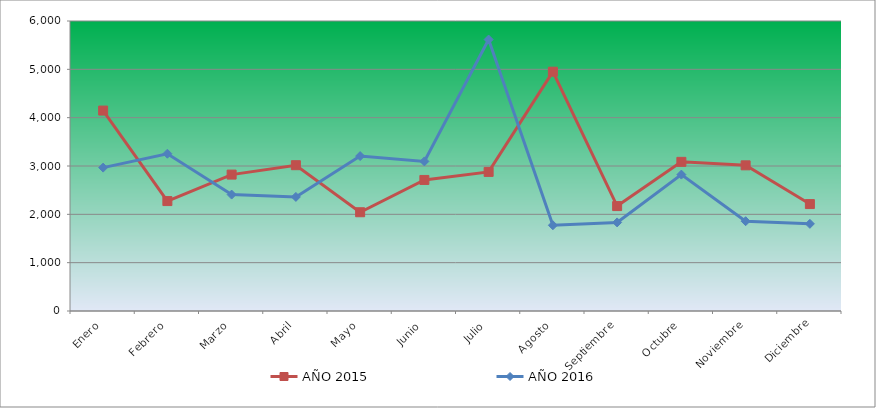
| Category | AÑO 2015 | AÑO 2016 |
|---|---|---|
| Enero | 4146.808 | 2966.609 |
| Febrero | 2274.503 | 3253.957 |
| Marzo | 2822.326 | 2408.709 |
| Abril | 3016.49 | 2360.535 |
| Mayo | 2043.33 | 3204.707 |
| Junio | 2711.374 | 3095.569 |
| Julio | 2877.801 | 5616.547 |
| Agosto | 4951.205 | 1774.115 |
| Septiembre | 2170.486 | 1832.821 |
| Octubre | 3085.724 | 2821.63 |
| Noviembre | 3013.661 | 1858.082 |
| Diciembre | 2212.251 | 1803.091 |